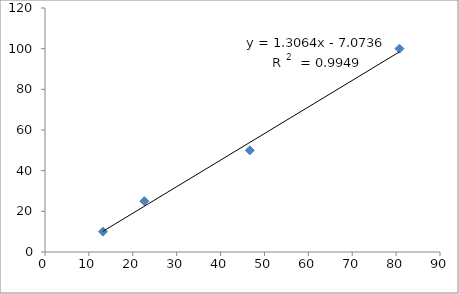
| Category | Series 0 |
|---|---|
| 13.218 | 10 |
| 22.636 | 25 |
| 46.661 | 50 |
| 80.759 | 100 |